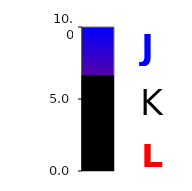
| Category | Series 0 |
|---|---|
| 0 | 6.618 |